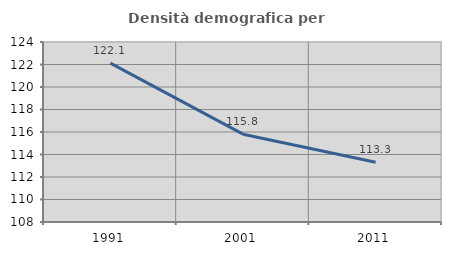
| Category | Densità demografica |
|---|---|
| 1991.0 | 122.122 |
| 2001.0 | 115.806 |
| 2011.0 | 113.305 |